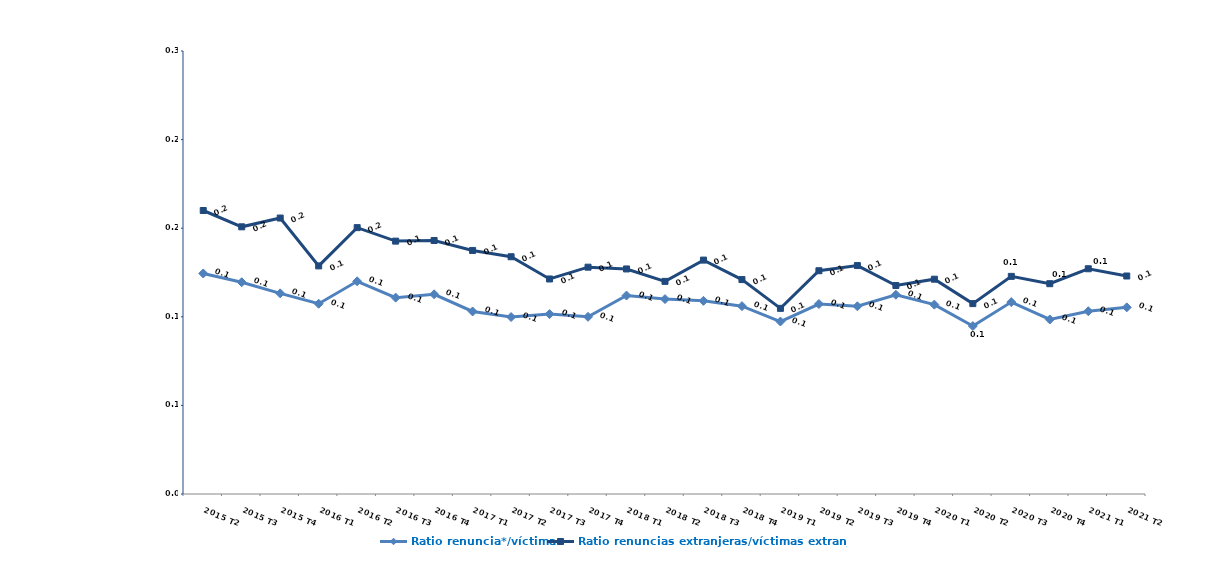
| Category | Ratio renuncia*/víctima | Ratio renuncias extranjeras/víctimas extranjeras |
|---|---|---|
| 2015 T2 | 0.124 | 0.16 |
| 2015 T3 | 0.12 | 0.151 |
| 2015 T4 | 0.113 | 0.156 |
| 2016 T1 | 0.107 | 0.129 |
| 2016 T2 | 0.12 | 0.15 |
| 2016 T3 | 0.111 | 0.143 |
| 2016 T4 | 0.113 | 0.143 |
| 2017 T1 | 0.103 | 0.137 |
| 2017 T2 | 0.1 | 0.134 |
| 2017 T3 | 0.102 | 0.121 |
| 2017 T4 | 0.1 | 0.128 |
| 2018 T1 | 0.112 | 0.127 |
| 2018 T2 | 0.11 | 0.12 |
| 2018 T3 | 0.109 | 0.132 |
| 2018 T4 | 0.106 | 0.121 |
| 2019 T1 | 0.097 | 0.105 |
| 2019 T2 | 0.107 | 0.126 |
| 2019 T3 | 0.106 | 0.129 |
| 2019 T4 | 0.112 | 0.118 |
| 2020 T1 | 0.107 | 0.121 |
| 2020 T2 | 0.095 | 0.107 |
| 2020 T3 | 0.108 | 0.123 |
| 2020 T4 | 0.098 | 0.119 |
| 2021 T1 | 0.103 | 0.127 |
| 2021 T2 | 0.105 | 0.123 |